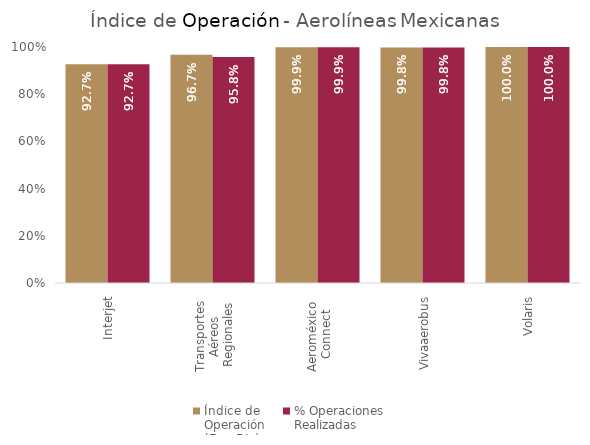
| Category | Índice de 
Operación
(Ene-Dic) | % Operaciones
Realizadas |
|---|---|---|
| Interjet | 0.927 | 0.927 |
| Transportes 
Aéreos 
Regionales | 0.967 | 0.958 |
| Aeroméxico 
Connect | 0.999 | 0.999 |
| Vivaaerobus | 0.998 | 0.998 |
| Volaris | 1 | 1 |